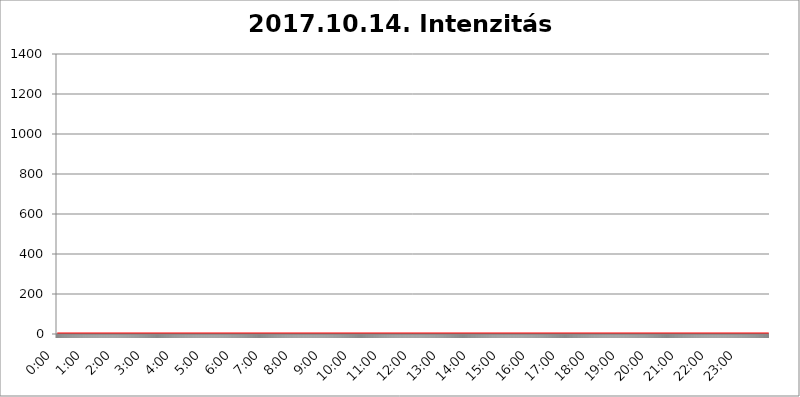
| Category | 2017.10.14. Intenzitás [W/m^2] |
|---|---|
| 0.0 | 0 |
| 0.0006944444444444445 | 0 |
| 0.001388888888888889 | 0 |
| 0.0020833333333333333 | 0 |
| 0.002777777777777778 | 0 |
| 0.003472222222222222 | 0 |
| 0.004166666666666667 | 0 |
| 0.004861111111111111 | 0 |
| 0.005555555555555556 | 0 |
| 0.0062499999999999995 | 0 |
| 0.006944444444444444 | 0 |
| 0.007638888888888889 | 0 |
| 0.008333333333333333 | 0 |
| 0.009027777777777779 | 0 |
| 0.009722222222222222 | 0 |
| 0.010416666666666666 | 0 |
| 0.011111111111111112 | 0 |
| 0.011805555555555555 | 0 |
| 0.012499999999999999 | 0 |
| 0.013194444444444444 | 0 |
| 0.013888888888888888 | 0 |
| 0.014583333333333332 | 0 |
| 0.015277777777777777 | 0 |
| 0.015972222222222224 | 0 |
| 0.016666666666666666 | 0 |
| 0.017361111111111112 | 0 |
| 0.018055555555555557 | 0 |
| 0.01875 | 0 |
| 0.019444444444444445 | 0 |
| 0.02013888888888889 | 0 |
| 0.020833333333333332 | 0 |
| 0.02152777777777778 | 0 |
| 0.022222222222222223 | 0 |
| 0.02291666666666667 | 0 |
| 0.02361111111111111 | 0 |
| 0.024305555555555556 | 0 |
| 0.024999999999999998 | 0 |
| 0.025694444444444447 | 0 |
| 0.02638888888888889 | 0 |
| 0.027083333333333334 | 0 |
| 0.027777777777777776 | 0 |
| 0.02847222222222222 | 0 |
| 0.029166666666666664 | 0 |
| 0.029861111111111113 | 0 |
| 0.030555555555555555 | 0 |
| 0.03125 | 0 |
| 0.03194444444444445 | 0 |
| 0.03263888888888889 | 0 |
| 0.03333333333333333 | 0 |
| 0.034027777777777775 | 0 |
| 0.034722222222222224 | 0 |
| 0.035416666666666666 | 0 |
| 0.036111111111111115 | 0 |
| 0.03680555555555556 | 0 |
| 0.0375 | 0 |
| 0.03819444444444444 | 0 |
| 0.03888888888888889 | 0 |
| 0.03958333333333333 | 0 |
| 0.04027777777777778 | 0 |
| 0.04097222222222222 | 0 |
| 0.041666666666666664 | 0 |
| 0.042361111111111106 | 0 |
| 0.04305555555555556 | 0 |
| 0.043750000000000004 | 0 |
| 0.044444444444444446 | 0 |
| 0.04513888888888889 | 0 |
| 0.04583333333333334 | 0 |
| 0.04652777777777778 | 0 |
| 0.04722222222222222 | 0 |
| 0.04791666666666666 | 0 |
| 0.04861111111111111 | 0 |
| 0.049305555555555554 | 0 |
| 0.049999999999999996 | 0 |
| 0.05069444444444445 | 0 |
| 0.051388888888888894 | 0 |
| 0.052083333333333336 | 0 |
| 0.05277777777777778 | 0 |
| 0.05347222222222222 | 0 |
| 0.05416666666666667 | 0 |
| 0.05486111111111111 | 0 |
| 0.05555555555555555 | 0 |
| 0.05625 | 0 |
| 0.05694444444444444 | 0 |
| 0.057638888888888885 | 0 |
| 0.05833333333333333 | 0 |
| 0.05902777777777778 | 0 |
| 0.059722222222222225 | 0 |
| 0.06041666666666667 | 0 |
| 0.061111111111111116 | 0 |
| 0.06180555555555556 | 0 |
| 0.0625 | 0 |
| 0.06319444444444444 | 0 |
| 0.06388888888888888 | 0 |
| 0.06458333333333334 | 0 |
| 0.06527777777777778 | 0 |
| 0.06597222222222222 | 0 |
| 0.06666666666666667 | 0 |
| 0.06736111111111111 | 0 |
| 0.06805555555555555 | 0 |
| 0.06874999999999999 | 0 |
| 0.06944444444444443 | 0 |
| 0.07013888888888889 | 0 |
| 0.07083333333333333 | 0 |
| 0.07152777777777779 | 0 |
| 0.07222222222222223 | 0 |
| 0.07291666666666667 | 0 |
| 0.07361111111111111 | 0 |
| 0.07430555555555556 | 0 |
| 0.075 | 0 |
| 0.07569444444444444 | 0 |
| 0.0763888888888889 | 0 |
| 0.07708333333333334 | 0 |
| 0.07777777777777778 | 0 |
| 0.07847222222222222 | 0 |
| 0.07916666666666666 | 0 |
| 0.0798611111111111 | 0 |
| 0.08055555555555556 | 0 |
| 0.08125 | 0 |
| 0.08194444444444444 | 0 |
| 0.08263888888888889 | 0 |
| 0.08333333333333333 | 0 |
| 0.08402777777777777 | 0 |
| 0.08472222222222221 | 0 |
| 0.08541666666666665 | 0 |
| 0.08611111111111112 | 0 |
| 0.08680555555555557 | 0 |
| 0.08750000000000001 | 0 |
| 0.08819444444444445 | 0 |
| 0.08888888888888889 | 0 |
| 0.08958333333333333 | 0 |
| 0.09027777777777778 | 0 |
| 0.09097222222222222 | 0 |
| 0.09166666666666667 | 0 |
| 0.09236111111111112 | 0 |
| 0.09305555555555556 | 0 |
| 0.09375 | 0 |
| 0.09444444444444444 | 0 |
| 0.09513888888888888 | 0 |
| 0.09583333333333333 | 0 |
| 0.09652777777777777 | 0 |
| 0.09722222222222222 | 0 |
| 0.09791666666666667 | 0 |
| 0.09861111111111111 | 0 |
| 0.09930555555555555 | 0 |
| 0.09999999999999999 | 0 |
| 0.10069444444444443 | 0 |
| 0.1013888888888889 | 0 |
| 0.10208333333333335 | 0 |
| 0.10277777777777779 | 0 |
| 0.10347222222222223 | 0 |
| 0.10416666666666667 | 0 |
| 0.10486111111111111 | 0 |
| 0.10555555555555556 | 0 |
| 0.10625 | 0 |
| 0.10694444444444444 | 0 |
| 0.1076388888888889 | 0 |
| 0.10833333333333334 | 0 |
| 0.10902777777777778 | 0 |
| 0.10972222222222222 | 0 |
| 0.1111111111111111 | 0 |
| 0.11180555555555556 | 0 |
| 0.11180555555555556 | 0 |
| 0.1125 | 0 |
| 0.11319444444444444 | 0 |
| 0.11388888888888889 | 0 |
| 0.11458333333333333 | 0 |
| 0.11527777777777777 | 0 |
| 0.11597222222222221 | 0 |
| 0.11666666666666665 | 0 |
| 0.1173611111111111 | 0 |
| 0.11805555555555557 | 0 |
| 0.11944444444444445 | 0 |
| 0.12013888888888889 | 0 |
| 0.12083333333333333 | 0 |
| 0.12152777777777778 | 0 |
| 0.12222222222222223 | 0 |
| 0.12291666666666667 | 0 |
| 0.12291666666666667 | 0 |
| 0.12361111111111112 | 0 |
| 0.12430555555555556 | 0 |
| 0.125 | 0 |
| 0.12569444444444444 | 0 |
| 0.12638888888888888 | 0 |
| 0.12708333333333333 | 0 |
| 0.16875 | 0 |
| 0.12847222222222224 | 0 |
| 0.12916666666666668 | 0 |
| 0.12986111111111112 | 0 |
| 0.13055555555555556 | 0 |
| 0.13125 | 0 |
| 0.13194444444444445 | 0 |
| 0.1326388888888889 | 0 |
| 0.13333333333333333 | 0 |
| 0.13402777777777777 | 0 |
| 0.13402777777777777 | 0 |
| 0.13472222222222222 | 0 |
| 0.13541666666666666 | 0 |
| 0.1361111111111111 | 0 |
| 0.13749999999999998 | 0 |
| 0.13819444444444443 | 0 |
| 0.1388888888888889 | 0 |
| 0.13958333333333334 | 0 |
| 0.14027777777777778 | 0 |
| 0.14097222222222222 | 0 |
| 0.14166666666666666 | 0 |
| 0.1423611111111111 | 0 |
| 0.14305555555555557 | 0 |
| 0.14375000000000002 | 0 |
| 0.14444444444444446 | 0 |
| 0.1451388888888889 | 0 |
| 0.1451388888888889 | 0 |
| 0.14652777777777778 | 0 |
| 0.14722222222222223 | 0 |
| 0.14791666666666667 | 0 |
| 0.1486111111111111 | 0 |
| 0.14930555555555555 | 0 |
| 0.15 | 0 |
| 0.15069444444444444 | 0 |
| 0.15138888888888888 | 0 |
| 0.15208333333333332 | 0 |
| 0.15277777777777776 | 0 |
| 0.15347222222222223 | 0 |
| 0.15416666666666667 | 0 |
| 0.15486111111111112 | 0 |
| 0.15555555555555556 | 0 |
| 0.15625 | 0 |
| 0.15694444444444444 | 0 |
| 0.15763888888888888 | 0 |
| 0.15833333333333333 | 0 |
| 0.15902777777777777 | 0 |
| 0.15972222222222224 | 0 |
| 0.16041666666666668 | 0 |
| 0.16111111111111112 | 0 |
| 0.16180555555555556 | 0 |
| 0.1625 | 0 |
| 0.16319444444444445 | 0 |
| 0.1638888888888889 | 0 |
| 0.16458333333333333 | 0 |
| 0.16527777777777777 | 0 |
| 0.16597222222222222 | 0 |
| 0.16666666666666666 | 0 |
| 0.1673611111111111 | 0 |
| 0.16805555555555554 | 0 |
| 0.16874999999999998 | 0 |
| 0.16944444444444443 | 0 |
| 0.17013888888888887 | 0 |
| 0.1708333333333333 | 0 |
| 0.17152777777777775 | 0 |
| 0.17222222222222225 | 0 |
| 0.1729166666666667 | 0 |
| 0.17361111111111113 | 0 |
| 0.17430555555555557 | 0 |
| 0.17500000000000002 | 0 |
| 0.17569444444444446 | 0 |
| 0.1763888888888889 | 0 |
| 0.17708333333333334 | 0 |
| 0.17777777777777778 | 0 |
| 0.17847222222222223 | 0 |
| 0.17916666666666667 | 0 |
| 0.1798611111111111 | 0 |
| 0.18055555555555555 | 0 |
| 0.18125 | 0 |
| 0.18194444444444444 | 0 |
| 0.1826388888888889 | 0 |
| 0.18333333333333335 | 0 |
| 0.1840277777777778 | 0 |
| 0.18472222222222223 | 0 |
| 0.18541666666666667 | 0 |
| 0.18611111111111112 | 0 |
| 0.18680555555555556 | 0 |
| 0.1875 | 0 |
| 0.18819444444444444 | 0 |
| 0.18888888888888888 | 0 |
| 0.18958333333333333 | 0 |
| 0.19027777777777777 | 0 |
| 0.1909722222222222 | 0 |
| 0.19166666666666665 | 0 |
| 0.19236111111111112 | 0 |
| 0.19305555555555554 | 0 |
| 0.19375 | 0 |
| 0.19444444444444445 | 0 |
| 0.1951388888888889 | 0 |
| 0.19583333333333333 | 0 |
| 0.19652777777777777 | 0 |
| 0.19722222222222222 | 0 |
| 0.19791666666666666 | 0 |
| 0.1986111111111111 | 0 |
| 0.19930555555555554 | 0 |
| 0.19999999999999998 | 0 |
| 0.20069444444444443 | 0 |
| 0.20138888888888887 | 0 |
| 0.2020833333333333 | 0 |
| 0.2027777777777778 | 0 |
| 0.2034722222222222 | 0 |
| 0.2041666666666667 | 0 |
| 0.20486111111111113 | 0 |
| 0.20555555555555557 | 0 |
| 0.20625000000000002 | 0 |
| 0.20694444444444446 | 0 |
| 0.2076388888888889 | 0 |
| 0.20833333333333334 | 0 |
| 0.20902777777777778 | 0 |
| 0.20972222222222223 | 0 |
| 0.21041666666666667 | 0 |
| 0.2111111111111111 | 0 |
| 0.21180555555555555 | 0 |
| 0.2125 | 0 |
| 0.21319444444444444 | 0 |
| 0.2138888888888889 | 0 |
| 0.21458333333333335 | 0 |
| 0.2152777777777778 | 0 |
| 0.21597222222222223 | 0 |
| 0.21666666666666667 | 0 |
| 0.21736111111111112 | 0 |
| 0.21805555555555556 | 0 |
| 0.21875 | 0 |
| 0.21944444444444444 | 0 |
| 0.22013888888888888 | 0 |
| 0.22083333333333333 | 0 |
| 0.22152777777777777 | 0 |
| 0.2222222222222222 | 0 |
| 0.22291666666666665 | 0 |
| 0.2236111111111111 | 0 |
| 0.22430555555555556 | 0 |
| 0.225 | 0 |
| 0.22569444444444445 | 0 |
| 0.2263888888888889 | 0 |
| 0.22708333333333333 | 0 |
| 0.22777777777777777 | 0 |
| 0.22847222222222222 | 0 |
| 0.22916666666666666 | 0 |
| 0.2298611111111111 | 0 |
| 0.23055555555555554 | 0 |
| 0.23124999999999998 | 0 |
| 0.23194444444444443 | 0 |
| 0.23263888888888887 | 0 |
| 0.2333333333333333 | 0 |
| 0.2340277777777778 | 0 |
| 0.2347222222222222 | 0 |
| 0.2354166666666667 | 0 |
| 0.23611111111111113 | 0 |
| 0.23680555555555557 | 0 |
| 0.23750000000000002 | 0 |
| 0.23819444444444446 | 0 |
| 0.2388888888888889 | 0 |
| 0.23958333333333334 | 0 |
| 0.24027777777777778 | 0 |
| 0.24097222222222223 | 0 |
| 0.24166666666666667 | 0 |
| 0.2423611111111111 | 0 |
| 0.24305555555555555 | 0 |
| 0.24375 | 0 |
| 0.24444444444444446 | 0 |
| 0.24513888888888888 | 0 |
| 0.24583333333333335 | 0 |
| 0.2465277777777778 | 0 |
| 0.24722222222222223 | 0 |
| 0.24791666666666667 | 0 |
| 0.24861111111111112 | 0 |
| 0.24930555555555556 | 0 |
| 0.25 | 0 |
| 0.25069444444444444 | 0 |
| 0.2513888888888889 | 0 |
| 0.2520833333333333 | 0 |
| 0.25277777777777777 | 0 |
| 0.2534722222222222 | 0 |
| 0.25416666666666665 | 0 |
| 0.2548611111111111 | 0 |
| 0.2555555555555556 | 0 |
| 0.25625000000000003 | 0 |
| 0.2569444444444445 | 0 |
| 0.2576388888888889 | 0 |
| 0.25833333333333336 | 0 |
| 0.2590277777777778 | 0 |
| 0.25972222222222224 | 0 |
| 0.2604166666666667 | 0 |
| 0.2611111111111111 | 0 |
| 0.26180555555555557 | 0 |
| 0.2625 | 0 |
| 0.26319444444444445 | 0 |
| 0.2638888888888889 | 0 |
| 0.26458333333333334 | 0 |
| 0.2652777777777778 | 0 |
| 0.2659722222222222 | 0 |
| 0.26666666666666666 | 0 |
| 0.2673611111111111 | 0 |
| 0.26805555555555555 | 0 |
| 0.26875 | 0 |
| 0.26944444444444443 | 0 |
| 0.2701388888888889 | 0 |
| 0.2708333333333333 | 0 |
| 0.27152777777777776 | 0 |
| 0.2722222222222222 | 0 |
| 0.27291666666666664 | 0 |
| 0.2736111111111111 | 0 |
| 0.2743055555555555 | 0 |
| 0.27499999999999997 | 0 |
| 0.27569444444444446 | 0 |
| 0.27638888888888885 | 0 |
| 0.27708333333333335 | 0 |
| 0.2777777777777778 | 0 |
| 0.27847222222222223 | 0 |
| 0.2791666666666667 | 0 |
| 0.2798611111111111 | 0 |
| 0.28055555555555556 | 0 |
| 0.28125 | 0 |
| 0.28194444444444444 | 0 |
| 0.2826388888888889 | 0 |
| 0.2833333333333333 | 0 |
| 0.28402777777777777 | 0 |
| 0.2847222222222222 | 0 |
| 0.28541666666666665 | 0 |
| 0.28611111111111115 | 0 |
| 0.28680555555555554 | 0 |
| 0.28750000000000003 | 0 |
| 0.2881944444444445 | 0 |
| 0.2888888888888889 | 0 |
| 0.28958333333333336 | 0 |
| 0.2902777777777778 | 0 |
| 0.29097222222222224 | 0 |
| 0.2916666666666667 | 0 |
| 0.2923611111111111 | 0 |
| 0.29305555555555557 | 0 |
| 0.29375 | 0 |
| 0.29444444444444445 | 0 |
| 0.2951388888888889 | 0 |
| 0.29583333333333334 | 0 |
| 0.2965277777777778 | 0 |
| 0.2972222222222222 | 0 |
| 0.29791666666666666 | 0 |
| 0.2986111111111111 | 0 |
| 0.29930555555555555 | 0 |
| 0.3 | 0 |
| 0.30069444444444443 | 0 |
| 0.3013888888888889 | 0 |
| 0.3020833333333333 | 0 |
| 0.30277777777777776 | 0 |
| 0.3034722222222222 | 0 |
| 0.30416666666666664 | 0 |
| 0.3048611111111111 | 0 |
| 0.3055555555555555 | 0 |
| 0.30624999999999997 | 0 |
| 0.3069444444444444 | 0 |
| 0.3076388888888889 | 0 |
| 0.30833333333333335 | 0 |
| 0.3090277777777778 | 0 |
| 0.30972222222222223 | 0 |
| 0.3104166666666667 | 0 |
| 0.3111111111111111 | 0 |
| 0.31180555555555556 | 0 |
| 0.3125 | 0 |
| 0.31319444444444444 | 0 |
| 0.3138888888888889 | 0 |
| 0.3145833333333333 | 0 |
| 0.31527777777777777 | 0 |
| 0.3159722222222222 | 0 |
| 0.31666666666666665 | 0 |
| 0.31736111111111115 | 0 |
| 0.31805555555555554 | 0 |
| 0.31875000000000003 | 0 |
| 0.3194444444444445 | 0 |
| 0.3201388888888889 | 0 |
| 0.32083333333333336 | 0 |
| 0.3215277777777778 | 0 |
| 0.32222222222222224 | 0 |
| 0.3229166666666667 | 0 |
| 0.3236111111111111 | 0 |
| 0.32430555555555557 | 0 |
| 0.325 | 0 |
| 0.32569444444444445 | 0 |
| 0.3263888888888889 | 0 |
| 0.32708333333333334 | 0 |
| 0.3277777777777778 | 0 |
| 0.3284722222222222 | 0 |
| 0.32916666666666666 | 0 |
| 0.3298611111111111 | 0 |
| 0.33055555555555555 | 0 |
| 0.33125 | 0 |
| 0.33194444444444443 | 0 |
| 0.3326388888888889 | 0 |
| 0.3333333333333333 | 0 |
| 0.3340277777777778 | 0 |
| 0.3347222222222222 | 0 |
| 0.3354166666666667 | 0 |
| 0.3361111111111111 | 0 |
| 0.3368055555555556 | 0 |
| 0.33749999999999997 | 0 |
| 0.33819444444444446 | 0 |
| 0.33888888888888885 | 0 |
| 0.33958333333333335 | 0 |
| 0.34027777777777773 | 0 |
| 0.34097222222222223 | 0 |
| 0.3416666666666666 | 0 |
| 0.3423611111111111 | 0 |
| 0.3430555555555555 | 0 |
| 0.34375 | 0 |
| 0.3444444444444445 | 0 |
| 0.3451388888888889 | 0 |
| 0.3458333333333334 | 0 |
| 0.34652777777777777 | 0 |
| 0.34722222222222227 | 0 |
| 0.34791666666666665 | 0 |
| 0.34861111111111115 | 0 |
| 0.34930555555555554 | 0 |
| 0.35000000000000003 | 0 |
| 0.3506944444444444 | 0 |
| 0.3513888888888889 | 0 |
| 0.3520833333333333 | 0 |
| 0.3527777777777778 | 0 |
| 0.3534722222222222 | 0 |
| 0.3541666666666667 | 0 |
| 0.3548611111111111 | 0 |
| 0.35555555555555557 | 0 |
| 0.35625 | 0 |
| 0.35694444444444445 | 0 |
| 0.3576388888888889 | 0 |
| 0.35833333333333334 | 0 |
| 0.3590277777777778 | 0 |
| 0.3597222222222222 | 0 |
| 0.36041666666666666 | 0 |
| 0.3611111111111111 | 0 |
| 0.36180555555555555 | 0 |
| 0.3625 | 0 |
| 0.36319444444444443 | 0 |
| 0.3638888888888889 | 0 |
| 0.3645833333333333 | 0 |
| 0.3652777777777778 | 0 |
| 0.3659722222222222 | 0 |
| 0.3666666666666667 | 0 |
| 0.3673611111111111 | 0 |
| 0.3680555555555556 | 0 |
| 0.36874999999999997 | 0 |
| 0.36944444444444446 | 0 |
| 0.37013888888888885 | 0 |
| 0.37083333333333335 | 0 |
| 0.37152777777777773 | 0 |
| 0.37222222222222223 | 0 |
| 0.3729166666666666 | 0 |
| 0.3736111111111111 | 0 |
| 0.3743055555555555 | 0 |
| 0.375 | 0 |
| 0.3756944444444445 | 0 |
| 0.3763888888888889 | 0 |
| 0.3770833333333334 | 0 |
| 0.37777777777777777 | 0 |
| 0.37847222222222227 | 0 |
| 0.37916666666666665 | 0 |
| 0.37986111111111115 | 0 |
| 0.38055555555555554 | 0 |
| 0.38125000000000003 | 0 |
| 0.3819444444444444 | 0 |
| 0.3826388888888889 | 0 |
| 0.3833333333333333 | 0 |
| 0.3840277777777778 | 0 |
| 0.3847222222222222 | 0 |
| 0.3854166666666667 | 0 |
| 0.3861111111111111 | 0 |
| 0.38680555555555557 | 0 |
| 0.3875 | 0 |
| 0.38819444444444445 | 0 |
| 0.3888888888888889 | 0 |
| 0.38958333333333334 | 0 |
| 0.3902777777777778 | 0 |
| 0.3909722222222222 | 0 |
| 0.39166666666666666 | 0 |
| 0.3923611111111111 | 0 |
| 0.39305555555555555 | 0 |
| 0.39375 | 0 |
| 0.39444444444444443 | 0 |
| 0.3951388888888889 | 0 |
| 0.3958333333333333 | 0 |
| 0.3965277777777778 | 0 |
| 0.3972222222222222 | 0 |
| 0.3979166666666667 | 0 |
| 0.3986111111111111 | 0 |
| 0.3993055555555556 | 0 |
| 0.39999999999999997 | 0 |
| 0.40069444444444446 | 0 |
| 0.40138888888888885 | 0 |
| 0.40208333333333335 | 0 |
| 0.40277777777777773 | 0 |
| 0.40347222222222223 | 0 |
| 0.4041666666666666 | 0 |
| 0.4048611111111111 | 0 |
| 0.4055555555555555 | 0 |
| 0.40625 | 0 |
| 0.4069444444444445 | 0 |
| 0.4076388888888889 | 0 |
| 0.4083333333333334 | 0 |
| 0.40902777777777777 | 0 |
| 0.40972222222222227 | 0 |
| 0.41041666666666665 | 0 |
| 0.41111111111111115 | 0 |
| 0.41180555555555554 | 0 |
| 0.41250000000000003 | 0 |
| 0.4131944444444444 | 0 |
| 0.4138888888888889 | 0 |
| 0.4145833333333333 | 0 |
| 0.4152777777777778 | 0 |
| 0.4159722222222222 | 0 |
| 0.4166666666666667 | 0 |
| 0.4173611111111111 | 0 |
| 0.41805555555555557 | 0 |
| 0.41875 | 0 |
| 0.41944444444444445 | 0 |
| 0.4201388888888889 | 0 |
| 0.42083333333333334 | 0 |
| 0.4215277777777778 | 0 |
| 0.4222222222222222 | 0 |
| 0.42291666666666666 | 0 |
| 0.4236111111111111 | 0 |
| 0.42430555555555555 | 0 |
| 0.425 | 0 |
| 0.42569444444444443 | 0 |
| 0.4263888888888889 | 0 |
| 0.4270833333333333 | 0 |
| 0.4277777777777778 | 0 |
| 0.4284722222222222 | 0 |
| 0.4291666666666667 | 0 |
| 0.4298611111111111 | 0 |
| 0.4305555555555556 | 0 |
| 0.43124999999999997 | 0 |
| 0.43194444444444446 | 0 |
| 0.43263888888888885 | 0 |
| 0.43333333333333335 | 0 |
| 0.43402777777777773 | 0 |
| 0.43472222222222223 | 0 |
| 0.4354166666666666 | 0 |
| 0.4361111111111111 | 0 |
| 0.4368055555555555 | 0 |
| 0.4375 | 0 |
| 0.4381944444444445 | 0 |
| 0.4388888888888889 | 0 |
| 0.4395833333333334 | 0 |
| 0.44027777777777777 | 0 |
| 0.44097222222222227 | 0 |
| 0.44166666666666665 | 0 |
| 0.44236111111111115 | 0 |
| 0.44305555555555554 | 0 |
| 0.44375000000000003 | 0 |
| 0.4444444444444444 | 0 |
| 0.4451388888888889 | 0 |
| 0.4458333333333333 | 0 |
| 0.4465277777777778 | 0 |
| 0.4472222222222222 | 0 |
| 0.4479166666666667 | 0 |
| 0.4486111111111111 | 0 |
| 0.44930555555555557 | 0 |
| 0.45 | 0 |
| 0.45069444444444445 | 0 |
| 0.4513888888888889 | 0 |
| 0.45208333333333334 | 0 |
| 0.4527777777777778 | 0 |
| 0.4534722222222222 | 0 |
| 0.45416666666666666 | 0 |
| 0.4548611111111111 | 0 |
| 0.45555555555555555 | 0 |
| 0.45625 | 0 |
| 0.45694444444444443 | 0 |
| 0.4576388888888889 | 0 |
| 0.4583333333333333 | 0 |
| 0.4590277777777778 | 0 |
| 0.4597222222222222 | 0 |
| 0.4604166666666667 | 0 |
| 0.4611111111111111 | 0 |
| 0.4618055555555556 | 0 |
| 0.46249999999999997 | 0 |
| 0.46319444444444446 | 0 |
| 0.46388888888888885 | 0 |
| 0.46458333333333335 | 0 |
| 0.46527777777777773 | 0 |
| 0.46597222222222223 | 0 |
| 0.4666666666666666 | 0 |
| 0.4673611111111111 | 0 |
| 0.4680555555555555 | 0 |
| 0.46875 | 0 |
| 0.4694444444444445 | 0 |
| 0.4701388888888889 | 0 |
| 0.4708333333333334 | 0 |
| 0.47152777777777777 | 0 |
| 0.47222222222222227 | 0 |
| 0.47291666666666665 | 0 |
| 0.47361111111111115 | 0 |
| 0.47430555555555554 | 0 |
| 0.47500000000000003 | 0 |
| 0.4756944444444444 | 0 |
| 0.4763888888888889 | 0 |
| 0.4770833333333333 | 0 |
| 0.4777777777777778 | 0 |
| 0.4784722222222222 | 0 |
| 0.4791666666666667 | 0 |
| 0.4798611111111111 | 0 |
| 0.48055555555555557 | 0 |
| 0.48125 | 0 |
| 0.48194444444444445 | 0 |
| 0.4826388888888889 | 0 |
| 0.48333333333333334 | 0 |
| 0.4840277777777778 | 0 |
| 0.4847222222222222 | 0 |
| 0.48541666666666666 | 0 |
| 0.4861111111111111 | 0 |
| 0.48680555555555555 | 0 |
| 0.4875 | 0 |
| 0.48819444444444443 | 0 |
| 0.4888888888888889 | 0 |
| 0.4895833333333333 | 0 |
| 0.4902777777777778 | 0 |
| 0.4909722222222222 | 0 |
| 0.4916666666666667 | 0 |
| 0.4923611111111111 | 0 |
| 0.4930555555555556 | 0 |
| 0.49374999999999997 | 0 |
| 0.49444444444444446 | 0 |
| 0.49513888888888885 | 0 |
| 0.49583333333333335 | 0 |
| 0.49652777777777773 | 0 |
| 0.49722222222222223 | 0 |
| 0.4979166666666666 | 0 |
| 0.4986111111111111 | 0 |
| 0.4993055555555555 | 0 |
| 0.5 | 0 |
| 0.5006944444444444 | 0 |
| 0.5013888888888889 | 0 |
| 0.5020833333333333 | 0 |
| 0.5027777777777778 | 0 |
| 0.5034722222222222 | 0 |
| 0.5041666666666667 | 0 |
| 0.5048611111111111 | 0 |
| 0.5055555555555555 | 0 |
| 0.50625 | 0 |
| 0.5069444444444444 | 0 |
| 0.5076388888888889 | 0 |
| 0.5083333333333333 | 0 |
| 0.5090277777777777 | 0 |
| 0.5097222222222222 | 0 |
| 0.5104166666666666 | 0 |
| 0.5111111111111112 | 0 |
| 0.5118055555555555 | 0 |
| 0.5125000000000001 | 0 |
| 0.5131944444444444 | 0 |
| 0.513888888888889 | 0 |
| 0.5145833333333333 | 0 |
| 0.5152777777777778 | 0 |
| 0.5159722222222222 | 0 |
| 0.5166666666666667 | 0 |
| 0.517361111111111 | 0 |
| 0.5180555555555556 | 0 |
| 0.5187499999999999 | 0 |
| 0.5194444444444445 | 0 |
| 0.5201388888888888 | 0 |
| 0.5208333333333334 | 0 |
| 0.5215277777777778 | 0 |
| 0.5222222222222223 | 0 |
| 0.5229166666666667 | 0 |
| 0.5236111111111111 | 0 |
| 0.5243055555555556 | 0 |
| 0.525 | 0 |
| 0.5256944444444445 | 0 |
| 0.5263888888888889 | 0 |
| 0.5270833333333333 | 0 |
| 0.5277777777777778 | 0 |
| 0.5284722222222222 | 0 |
| 0.5291666666666667 | 0 |
| 0.5298611111111111 | 0 |
| 0.5305555555555556 | 0 |
| 0.53125 | 0 |
| 0.5319444444444444 | 0 |
| 0.5326388888888889 | 0 |
| 0.5333333333333333 | 0 |
| 0.5340277777777778 | 0 |
| 0.5347222222222222 | 0 |
| 0.5354166666666667 | 0 |
| 0.5361111111111111 | 0 |
| 0.5368055555555555 | 0 |
| 0.5375 | 0 |
| 0.5381944444444444 | 0 |
| 0.5388888888888889 | 0 |
| 0.5395833333333333 | 0 |
| 0.5402777777777777 | 0 |
| 0.5409722222222222 | 0 |
| 0.5416666666666666 | 0 |
| 0.5423611111111112 | 0 |
| 0.5430555555555555 | 0 |
| 0.5437500000000001 | 0 |
| 0.5444444444444444 | 0 |
| 0.545138888888889 | 0 |
| 0.5458333333333333 | 0 |
| 0.5465277777777778 | 0 |
| 0.5472222222222222 | 0 |
| 0.5479166666666667 | 0 |
| 0.548611111111111 | 0 |
| 0.5493055555555556 | 0 |
| 0.5499999999999999 | 0 |
| 0.5506944444444445 | 0 |
| 0.5513888888888888 | 0 |
| 0.5520833333333334 | 0 |
| 0.5527777777777778 | 0 |
| 0.5534722222222223 | 0 |
| 0.5541666666666667 | 0 |
| 0.5548611111111111 | 0 |
| 0.5555555555555556 | 0 |
| 0.55625 | 0 |
| 0.5569444444444445 | 0 |
| 0.5576388888888889 | 0 |
| 0.5583333333333333 | 0 |
| 0.5590277777777778 | 0 |
| 0.5597222222222222 | 0 |
| 0.5604166666666667 | 0 |
| 0.5611111111111111 | 0 |
| 0.5618055555555556 | 0 |
| 0.5625 | 0 |
| 0.5631944444444444 | 0 |
| 0.5638888888888889 | 0 |
| 0.5645833333333333 | 0 |
| 0.5652777777777778 | 0 |
| 0.5659722222222222 | 0 |
| 0.5666666666666667 | 0 |
| 0.5673611111111111 | 0 |
| 0.5680555555555555 | 0 |
| 0.56875 | 0 |
| 0.5694444444444444 | 0 |
| 0.5701388888888889 | 0 |
| 0.5708333333333333 | 0 |
| 0.5715277777777777 | 0 |
| 0.5722222222222222 | 0 |
| 0.5729166666666666 | 0 |
| 0.5736111111111112 | 0 |
| 0.5743055555555555 | 0 |
| 0.5750000000000001 | 0 |
| 0.5756944444444444 | 0 |
| 0.576388888888889 | 0 |
| 0.5770833333333333 | 0 |
| 0.5777777777777778 | 0 |
| 0.5784722222222222 | 0 |
| 0.5791666666666667 | 0 |
| 0.579861111111111 | 0 |
| 0.5805555555555556 | 0 |
| 0.5812499999999999 | 0 |
| 0.5819444444444445 | 0 |
| 0.5826388888888888 | 0 |
| 0.5833333333333334 | 0 |
| 0.5840277777777778 | 0 |
| 0.5847222222222223 | 0 |
| 0.5854166666666667 | 0 |
| 0.5861111111111111 | 0 |
| 0.5868055555555556 | 0 |
| 0.5875 | 0 |
| 0.5881944444444445 | 0 |
| 0.5888888888888889 | 0 |
| 0.5895833333333333 | 0 |
| 0.5902777777777778 | 0 |
| 0.5909722222222222 | 0 |
| 0.5916666666666667 | 0 |
| 0.5923611111111111 | 0 |
| 0.5930555555555556 | 0 |
| 0.59375 | 0 |
| 0.5944444444444444 | 0 |
| 0.5951388888888889 | 0 |
| 0.5958333333333333 | 0 |
| 0.5965277777777778 | 0 |
| 0.5972222222222222 | 0 |
| 0.5979166666666667 | 0 |
| 0.5986111111111111 | 0 |
| 0.5993055555555555 | 0 |
| 0.6 | 0 |
| 0.6006944444444444 | 0 |
| 0.6013888888888889 | 0 |
| 0.6020833333333333 | 0 |
| 0.6027777777777777 | 0 |
| 0.6034722222222222 | 0 |
| 0.6041666666666666 | 0 |
| 0.6048611111111112 | 0 |
| 0.6055555555555555 | 0 |
| 0.6062500000000001 | 0 |
| 0.6069444444444444 | 0 |
| 0.607638888888889 | 0 |
| 0.6083333333333333 | 0 |
| 0.6090277777777778 | 0 |
| 0.6097222222222222 | 0 |
| 0.6104166666666667 | 0 |
| 0.611111111111111 | 0 |
| 0.6118055555555556 | 0 |
| 0.6124999999999999 | 0 |
| 0.6131944444444445 | 0 |
| 0.6138888888888888 | 0 |
| 0.6145833333333334 | 0 |
| 0.6152777777777778 | 0 |
| 0.6159722222222223 | 0 |
| 0.6166666666666667 | 0 |
| 0.6173611111111111 | 0 |
| 0.6180555555555556 | 0 |
| 0.61875 | 0 |
| 0.6194444444444445 | 0 |
| 0.6201388888888889 | 0 |
| 0.6208333333333333 | 0 |
| 0.6215277777777778 | 0 |
| 0.6222222222222222 | 0 |
| 0.6229166666666667 | 0 |
| 0.6236111111111111 | 0 |
| 0.6243055555555556 | 0 |
| 0.625 | 0 |
| 0.6256944444444444 | 0 |
| 0.6263888888888889 | 0 |
| 0.6270833333333333 | 0 |
| 0.6277777777777778 | 0 |
| 0.6284722222222222 | 0 |
| 0.6291666666666667 | 0 |
| 0.6298611111111111 | 0 |
| 0.6305555555555555 | 0 |
| 0.63125 | 0 |
| 0.6319444444444444 | 0 |
| 0.6326388888888889 | 0 |
| 0.6333333333333333 | 0 |
| 0.6340277777777777 | 0 |
| 0.6347222222222222 | 0 |
| 0.6354166666666666 | 0 |
| 0.6361111111111112 | 0 |
| 0.6368055555555555 | 0 |
| 0.6375000000000001 | 0 |
| 0.6381944444444444 | 0 |
| 0.638888888888889 | 0 |
| 0.6395833333333333 | 0 |
| 0.6402777777777778 | 0 |
| 0.6409722222222222 | 0 |
| 0.6416666666666667 | 0 |
| 0.642361111111111 | 0 |
| 0.6430555555555556 | 0 |
| 0.6437499999999999 | 0 |
| 0.6444444444444445 | 0 |
| 0.6451388888888888 | 0 |
| 0.6458333333333334 | 0 |
| 0.6465277777777778 | 0 |
| 0.6472222222222223 | 0 |
| 0.6479166666666667 | 0 |
| 0.6486111111111111 | 0 |
| 0.6493055555555556 | 0 |
| 0.65 | 0 |
| 0.6506944444444445 | 0 |
| 0.6513888888888889 | 0 |
| 0.6520833333333333 | 0 |
| 0.6527777777777778 | 0 |
| 0.6534722222222222 | 0 |
| 0.6541666666666667 | 0 |
| 0.6548611111111111 | 0 |
| 0.6555555555555556 | 0 |
| 0.65625 | 0 |
| 0.6569444444444444 | 0 |
| 0.6576388888888889 | 0 |
| 0.6583333333333333 | 0 |
| 0.6590277777777778 | 0 |
| 0.6597222222222222 | 0 |
| 0.6604166666666667 | 0 |
| 0.6611111111111111 | 0 |
| 0.6618055555555555 | 0 |
| 0.6625 | 0 |
| 0.6631944444444444 | 0 |
| 0.6638888888888889 | 0 |
| 0.6645833333333333 | 0 |
| 0.6652777777777777 | 0 |
| 0.6659722222222222 | 0 |
| 0.6666666666666666 | 0 |
| 0.6673611111111111 | 0 |
| 0.6680555555555556 | 0 |
| 0.6687500000000001 | 0 |
| 0.6694444444444444 | 0 |
| 0.6701388888888888 | 0 |
| 0.6708333333333334 | 0 |
| 0.6715277777777778 | 0 |
| 0.6722222222222222 | 0 |
| 0.6729166666666666 | 0 |
| 0.6736111111111112 | 0 |
| 0.6743055555555556 | 0 |
| 0.6749999999999999 | 0 |
| 0.6756944444444444 | 0 |
| 0.6763888888888889 | 0 |
| 0.6770833333333334 | 0 |
| 0.6777777777777777 | 0 |
| 0.6784722222222223 | 0 |
| 0.6791666666666667 | 0 |
| 0.6798611111111111 | 0 |
| 0.6805555555555555 | 0 |
| 0.68125 | 0 |
| 0.6819444444444445 | 0 |
| 0.6826388888888889 | 0 |
| 0.6833333333333332 | 0 |
| 0.6840277777777778 | 0 |
| 0.6847222222222222 | 0 |
| 0.6854166666666667 | 0 |
| 0.686111111111111 | 0 |
| 0.6868055555555556 | 0 |
| 0.6875 | 0 |
| 0.6881944444444444 | 0 |
| 0.688888888888889 | 0 |
| 0.6895833333333333 | 0 |
| 0.6902777777777778 | 0 |
| 0.6909722222222222 | 0 |
| 0.6916666666666668 | 0 |
| 0.6923611111111111 | 0 |
| 0.6930555555555555 | 0 |
| 0.69375 | 0 |
| 0.6944444444444445 | 0 |
| 0.6951388888888889 | 0 |
| 0.6958333333333333 | 0 |
| 0.6965277777777777 | 0 |
| 0.6972222222222223 | 0 |
| 0.6979166666666666 | 0 |
| 0.6986111111111111 | 0 |
| 0.6993055555555556 | 0 |
| 0.7000000000000001 | 0 |
| 0.7006944444444444 | 0 |
| 0.7013888888888888 | 0 |
| 0.7020833333333334 | 0 |
| 0.7027777777777778 | 0 |
| 0.7034722222222222 | 0 |
| 0.7041666666666666 | 0 |
| 0.7048611111111112 | 0 |
| 0.7055555555555556 | 0 |
| 0.7062499999999999 | 0 |
| 0.7069444444444444 | 0 |
| 0.7076388888888889 | 0 |
| 0.7083333333333334 | 0 |
| 0.7090277777777777 | 0 |
| 0.7097222222222223 | 0 |
| 0.7104166666666667 | 0 |
| 0.7111111111111111 | 0 |
| 0.7118055555555555 | 0 |
| 0.7125 | 0 |
| 0.7131944444444445 | 0 |
| 0.7138888888888889 | 0 |
| 0.7145833333333332 | 0 |
| 0.7152777777777778 | 0 |
| 0.7159722222222222 | 0 |
| 0.7166666666666667 | 0 |
| 0.717361111111111 | 0 |
| 0.7180555555555556 | 0 |
| 0.71875 | 0 |
| 0.7194444444444444 | 0 |
| 0.720138888888889 | 0 |
| 0.7208333333333333 | 0 |
| 0.7215277777777778 | 0 |
| 0.7222222222222222 | 0 |
| 0.7229166666666668 | 0 |
| 0.7236111111111111 | 0 |
| 0.7243055555555555 | 0 |
| 0.725 | 0 |
| 0.7256944444444445 | 0 |
| 0.7263888888888889 | 0 |
| 0.7270833333333333 | 0 |
| 0.7277777777777777 | 0 |
| 0.7284722222222223 | 0 |
| 0.7291666666666666 | 0 |
| 0.7298611111111111 | 0 |
| 0.7305555555555556 | 0 |
| 0.7312500000000001 | 0 |
| 0.7319444444444444 | 0 |
| 0.7326388888888888 | 0 |
| 0.7333333333333334 | 0 |
| 0.7340277777777778 | 0 |
| 0.7347222222222222 | 0 |
| 0.7354166666666666 | 0 |
| 0.7361111111111112 | 0 |
| 0.7368055555555556 | 0 |
| 0.7374999999999999 | 0 |
| 0.7381944444444444 | 0 |
| 0.7388888888888889 | 0 |
| 0.7395833333333334 | 0 |
| 0.7402777777777777 | 0 |
| 0.7409722222222223 | 0 |
| 0.7416666666666667 | 0 |
| 0.7423611111111111 | 0 |
| 0.7430555555555555 | 0 |
| 0.74375 | 0 |
| 0.7444444444444445 | 0 |
| 0.7451388888888889 | 0 |
| 0.7458333333333332 | 0 |
| 0.7465277777777778 | 0 |
| 0.7472222222222222 | 0 |
| 0.7479166666666667 | 0 |
| 0.748611111111111 | 0 |
| 0.7493055555555556 | 0 |
| 0.75 | 0 |
| 0.7506944444444444 | 0 |
| 0.751388888888889 | 0 |
| 0.7520833333333333 | 0 |
| 0.7527777777777778 | 0 |
| 0.7534722222222222 | 0 |
| 0.7541666666666668 | 0 |
| 0.7548611111111111 | 0 |
| 0.7555555555555555 | 0 |
| 0.75625 | 0 |
| 0.7569444444444445 | 0 |
| 0.7576388888888889 | 0 |
| 0.7583333333333333 | 0 |
| 0.7590277777777777 | 0 |
| 0.7597222222222223 | 0 |
| 0.7604166666666666 | 0 |
| 0.7611111111111111 | 0 |
| 0.7618055555555556 | 0 |
| 0.7625000000000001 | 0 |
| 0.7631944444444444 | 0 |
| 0.7638888888888888 | 0 |
| 0.7645833333333334 | 0 |
| 0.7652777777777778 | 0 |
| 0.7659722222222222 | 0 |
| 0.7666666666666666 | 0 |
| 0.7673611111111112 | 0 |
| 0.7680555555555556 | 0 |
| 0.7687499999999999 | 0 |
| 0.7694444444444444 | 0 |
| 0.7701388888888889 | 0 |
| 0.7708333333333334 | 0 |
| 0.7715277777777777 | 0 |
| 0.7722222222222223 | 0 |
| 0.7729166666666667 | 0 |
| 0.7736111111111111 | 0 |
| 0.7743055555555555 | 0 |
| 0.775 | 0 |
| 0.7756944444444445 | 0 |
| 0.7763888888888889 | 0 |
| 0.7770833333333332 | 0 |
| 0.7777777777777778 | 0 |
| 0.7784722222222222 | 0 |
| 0.7791666666666667 | 0 |
| 0.779861111111111 | 0 |
| 0.7805555555555556 | 0 |
| 0.78125 | 0 |
| 0.7819444444444444 | 0 |
| 0.782638888888889 | 0 |
| 0.7833333333333333 | 0 |
| 0.7840277777777778 | 0 |
| 0.7847222222222222 | 0 |
| 0.7854166666666668 | 0 |
| 0.7861111111111111 | 0 |
| 0.7868055555555555 | 0 |
| 0.7875 | 0 |
| 0.7881944444444445 | 0 |
| 0.7888888888888889 | 0 |
| 0.7895833333333333 | 0 |
| 0.7902777777777777 | 0 |
| 0.7909722222222223 | 0 |
| 0.7916666666666666 | 0 |
| 0.7923611111111111 | 0 |
| 0.7930555555555556 | 0 |
| 0.7937500000000001 | 0 |
| 0.7944444444444444 | 0 |
| 0.7951388888888888 | 0 |
| 0.7958333333333334 | 0 |
| 0.7965277777777778 | 0 |
| 0.7972222222222222 | 0 |
| 0.7979166666666666 | 0 |
| 0.7986111111111112 | 0 |
| 0.7993055555555556 | 0 |
| 0.7999999999999999 | 0 |
| 0.8006944444444444 | 0 |
| 0.8013888888888889 | 0 |
| 0.8020833333333334 | 0 |
| 0.8027777777777777 | 0 |
| 0.8034722222222223 | 0 |
| 0.8041666666666667 | 0 |
| 0.8048611111111111 | 0 |
| 0.8055555555555555 | 0 |
| 0.80625 | 0 |
| 0.8069444444444445 | 0 |
| 0.8076388888888889 | 0 |
| 0.8083333333333332 | 0 |
| 0.8090277777777778 | 0 |
| 0.8097222222222222 | 0 |
| 0.8104166666666667 | 0 |
| 0.811111111111111 | 0 |
| 0.8118055555555556 | 0 |
| 0.8125 | 0 |
| 0.8131944444444444 | 0 |
| 0.813888888888889 | 0 |
| 0.8145833333333333 | 0 |
| 0.8152777777777778 | 0 |
| 0.8159722222222222 | 0 |
| 0.8166666666666668 | 0 |
| 0.8173611111111111 | 0 |
| 0.8180555555555555 | 0 |
| 0.81875 | 0 |
| 0.8194444444444445 | 0 |
| 0.8201388888888889 | 0 |
| 0.8208333333333333 | 0 |
| 0.8215277777777777 | 0 |
| 0.8222222222222223 | 0 |
| 0.8229166666666666 | 0 |
| 0.8236111111111111 | 0 |
| 0.8243055555555556 | 0 |
| 0.8250000000000001 | 0 |
| 0.8256944444444444 | 0 |
| 0.8263888888888888 | 0 |
| 0.8270833333333334 | 0 |
| 0.8277777777777778 | 0 |
| 0.8284722222222222 | 0 |
| 0.8291666666666666 | 0 |
| 0.8298611111111112 | 0 |
| 0.8305555555555556 | 0 |
| 0.8312499999999999 | 0 |
| 0.8319444444444444 | 0 |
| 0.8326388888888889 | 0 |
| 0.8333333333333334 | 0 |
| 0.8340277777777777 | 0 |
| 0.8347222222222223 | 0 |
| 0.8354166666666667 | 0 |
| 0.8361111111111111 | 0 |
| 0.8368055555555555 | 0 |
| 0.8375 | 0 |
| 0.8381944444444445 | 0 |
| 0.8388888888888889 | 0 |
| 0.8395833333333332 | 0 |
| 0.8402777777777778 | 0 |
| 0.8409722222222222 | 0 |
| 0.8416666666666667 | 0 |
| 0.842361111111111 | 0 |
| 0.8430555555555556 | 0 |
| 0.84375 | 0 |
| 0.8444444444444444 | 0 |
| 0.845138888888889 | 0 |
| 0.8458333333333333 | 0 |
| 0.8465277777777778 | 0 |
| 0.8472222222222222 | 0 |
| 0.8479166666666668 | 0 |
| 0.8486111111111111 | 0 |
| 0.8493055555555555 | 0 |
| 0.85 | 0 |
| 0.8506944444444445 | 0 |
| 0.8513888888888889 | 0 |
| 0.8520833333333333 | 0 |
| 0.8527777777777777 | 0 |
| 0.8534722222222223 | 0 |
| 0.8541666666666666 | 0 |
| 0.8548611111111111 | 0 |
| 0.8555555555555556 | 0 |
| 0.8562500000000001 | 0 |
| 0.8569444444444444 | 0 |
| 0.8576388888888888 | 0 |
| 0.8583333333333334 | 0 |
| 0.8590277777777778 | 0 |
| 0.8597222222222222 | 0 |
| 0.8604166666666666 | 0 |
| 0.8611111111111112 | 0 |
| 0.8618055555555556 | 0 |
| 0.8624999999999999 | 0 |
| 0.8631944444444444 | 0 |
| 0.8638888888888889 | 0 |
| 0.8645833333333334 | 0 |
| 0.8652777777777777 | 0 |
| 0.8659722222222223 | 0 |
| 0.8666666666666667 | 0 |
| 0.8673611111111111 | 0 |
| 0.8680555555555555 | 0 |
| 0.86875 | 0 |
| 0.8694444444444445 | 0 |
| 0.8701388888888889 | 0 |
| 0.8708333333333332 | 0 |
| 0.8715277777777778 | 0 |
| 0.8722222222222222 | 0 |
| 0.8729166666666667 | 0 |
| 0.873611111111111 | 0 |
| 0.8743055555555556 | 0 |
| 0.875 | 0 |
| 0.8756944444444444 | 0 |
| 0.876388888888889 | 0 |
| 0.8770833333333333 | 0 |
| 0.8777777777777778 | 0 |
| 0.8784722222222222 | 0 |
| 0.8791666666666668 | 0 |
| 0.8798611111111111 | 0 |
| 0.8805555555555555 | 0 |
| 0.88125 | 0 |
| 0.8819444444444445 | 0 |
| 0.8826388888888889 | 0 |
| 0.8833333333333333 | 0 |
| 0.8840277777777777 | 0 |
| 0.8847222222222223 | 0 |
| 0.8854166666666666 | 0 |
| 0.8861111111111111 | 0 |
| 0.8868055555555556 | 0 |
| 0.8875000000000001 | 0 |
| 0.8881944444444444 | 0 |
| 0.8888888888888888 | 0 |
| 0.8895833333333334 | 0 |
| 0.8902777777777778 | 0 |
| 0.8909722222222222 | 0 |
| 0.8916666666666666 | 0 |
| 0.8923611111111112 | 0 |
| 0.8930555555555556 | 0 |
| 0.8937499999999999 | 0 |
| 0.8944444444444444 | 0 |
| 0.8951388888888889 | 0 |
| 0.8958333333333334 | 0 |
| 0.8965277777777777 | 0 |
| 0.8972222222222223 | 0 |
| 0.8979166666666667 | 0 |
| 0.8986111111111111 | 0 |
| 0.8993055555555555 | 0 |
| 0.9 | 0 |
| 0.9006944444444445 | 0 |
| 0.9013888888888889 | 0 |
| 0.9020833333333332 | 0 |
| 0.9027777777777778 | 0 |
| 0.9034722222222222 | 0 |
| 0.9041666666666667 | 0 |
| 0.904861111111111 | 0 |
| 0.9055555555555556 | 0 |
| 0.90625 | 0 |
| 0.9069444444444444 | 0 |
| 0.907638888888889 | 0 |
| 0.9083333333333333 | 0 |
| 0.9090277777777778 | 0 |
| 0.9097222222222222 | 0 |
| 0.9104166666666668 | 0 |
| 0.9111111111111111 | 0 |
| 0.9118055555555555 | 0 |
| 0.9125 | 0 |
| 0.9131944444444445 | 0 |
| 0.9138888888888889 | 0 |
| 0.9145833333333333 | 0 |
| 0.9152777777777777 | 0 |
| 0.9159722222222223 | 0 |
| 0.9166666666666666 | 0 |
| 0.9173611111111111 | 0 |
| 0.9180555555555556 | 0 |
| 0.9187500000000001 | 0 |
| 0.9194444444444444 | 0 |
| 0.9201388888888888 | 0 |
| 0.9208333333333334 | 0 |
| 0.9215277777777778 | 0 |
| 0.9222222222222222 | 0 |
| 0.9229166666666666 | 0 |
| 0.9236111111111112 | 0 |
| 0.9243055555555556 | 0 |
| 0.9249999999999999 | 0 |
| 0.9256944444444444 | 0 |
| 0.9263888888888889 | 0 |
| 0.9270833333333334 | 0 |
| 0.9277777777777777 | 0 |
| 0.9284722222222223 | 0 |
| 0.9291666666666667 | 0 |
| 0.9298611111111111 | 0 |
| 0.9305555555555555 | 0 |
| 0.93125 | 0 |
| 0.9319444444444445 | 0 |
| 0.9326388888888889 | 0 |
| 0.9333333333333332 | 0 |
| 0.9340277777777778 | 0 |
| 0.9347222222222222 | 0 |
| 0.9354166666666667 | 0 |
| 0.936111111111111 | 0 |
| 0.9368055555555556 | 0 |
| 0.9375 | 0 |
| 0.9381944444444444 | 0 |
| 0.938888888888889 | 0 |
| 0.9395833333333333 | 0 |
| 0.9402777777777778 | 0 |
| 0.9409722222222222 | 0 |
| 0.9416666666666668 | 0 |
| 0.9423611111111111 | 0 |
| 0.9430555555555555 | 0 |
| 0.94375 | 0 |
| 0.9444444444444445 | 0 |
| 0.9451388888888889 | 0 |
| 0.9458333333333333 | 0 |
| 0.9465277777777777 | 0 |
| 0.9472222222222223 | 0 |
| 0.9479166666666666 | 0 |
| 0.9486111111111111 | 0 |
| 0.9493055555555556 | 0 |
| 0.9500000000000001 | 0 |
| 0.9506944444444444 | 0 |
| 0.9513888888888888 | 0 |
| 0.9520833333333334 | 0 |
| 0.9527777777777778 | 0 |
| 0.9534722222222222 | 0 |
| 0.9541666666666666 | 0 |
| 0.9548611111111112 | 0 |
| 0.9555555555555556 | 0 |
| 0.9562499999999999 | 0 |
| 0.9569444444444444 | 0 |
| 0.9576388888888889 | 0 |
| 0.9583333333333334 | 0 |
| 0.9590277777777777 | 0 |
| 0.9597222222222223 | 0 |
| 0.9604166666666667 | 0 |
| 0.9611111111111111 | 0 |
| 0.9618055555555555 | 0 |
| 0.9625 | 0 |
| 0.9631944444444445 | 0 |
| 0.9638888888888889 | 0 |
| 0.9645833333333332 | 0 |
| 0.9652777777777778 | 0 |
| 0.9659722222222222 | 0 |
| 0.9666666666666667 | 0 |
| 0.967361111111111 | 0 |
| 0.9680555555555556 | 0 |
| 0.96875 | 0 |
| 0.9694444444444444 | 0 |
| 0.970138888888889 | 0 |
| 0.9708333333333333 | 0 |
| 0.9715277777777778 | 0 |
| 0.9722222222222222 | 0 |
| 0.9729166666666668 | 0 |
| 0.9736111111111111 | 0 |
| 0.9743055555555555 | 0 |
| 0.975 | 0 |
| 0.9756944444444445 | 0 |
| 0.9763888888888889 | 0 |
| 0.9770833333333333 | 0 |
| 0.9777777777777777 | 0 |
| 0.9784722222222223 | 0 |
| 0.9791666666666666 | 0 |
| 0.9798611111111111 | 0 |
| 0.9805555555555556 | 0 |
| 0.9812500000000001 | 0 |
| 0.9819444444444444 | 0 |
| 0.9826388888888888 | 0 |
| 0.9833333333333334 | 0 |
| 0.9840277777777778 | 0 |
| 0.9847222222222222 | 0 |
| 0.9854166666666666 | 0 |
| 0.9861111111111112 | 0 |
| 0.9868055555555556 | 0 |
| 0.9874999999999999 | 0 |
| 0.9881944444444444 | 0 |
| 0.9888888888888889 | 0 |
| 0.9895833333333334 | 0 |
| 0.9902777777777777 | 0 |
| 0.9909722222222223 | 0 |
| 0.9916666666666667 | 0 |
| 0.9923611111111111 | 0 |
| 0.9930555555555555 | 0 |
| 0.99375 | 0 |
| 0.9944444444444445 | 0 |
| 0.9951388888888889 | 0 |
| 0.9958333333333332 | 0 |
| 0.9965277777777778 | 0 |
| 0.9972222222222222 | 0 |
| 0.9979166666666667 | 0 |
| 0.998611111111111 | 0 |
| 0.9993055555555556 | 0 |